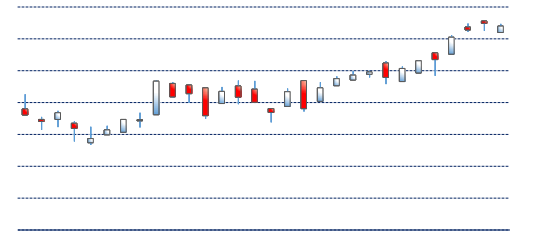
| Category | Series 0 | Series 1 | Series 2 | Series 3 |
|---|---|---|---|---|
| 2016-06-09 | 57.2 | 57.47 | 57.2 | 57.4 |
| 2016-06-08 | 57.56 | 57.56 | 57.25 | 57.49 |
| 2016-06-07 | 57.37 | 57.48 | 57.22 | 57.28 |
| 2016-06-06 | 56.52 | 57.12 | 56.52 | 57.05 |
| 2016-06-03 | 56.56 | 56.56 | 55.84 | 56.35 |
| 2016-06-02 | 55.93 | 56.33 | 55.93 | 56.31 |
| 2016-06-01 | 55.66 | 56.13 | 55.66 | 56.07 |
| 2016-05-31 | 56.24 | 56.3 | 55.58 | 55.79 |
| 2016-05-27 | 55.89 | 56 | 55.79 | 55.96 |
| 2016-05-26 | 55.71 | 55.99 | 55.71 | 55.86 |
| 2016-05-25 | 55.53 | 55.82 | 55.53 | 55.75 |
| 2016-05-24 | 55.04 | 55.64 | 55.04 | 55.46 |
| 2016-05-23 | 55.69 | 55.69 | 54.72 | 54.81 |
| 2016-05-20 | 54.88 | 55.44 | 54.88 | 55.34 |
| 2016-05-19 | 54.81 | 54.81 | 54.38 | 54.69 |
| 2016-05-18 | 55.42 | 55.68 | 55.01 | 55.01 |
| 2016-05-17 | 55.52 | 55.69 | 54.95 | 55.17 |
| 2016-05-16 | 54.97 | 55.49 | 54.97 | 55.35 |
| 2016-05-13 | 55.46 | 55.46 | 54.49 | 54.59 |
| 2016-05-12 | 55.55 | 55.55 | 54.99 | 55.28 |
| 2016-05-11 | 55.6 | 55.64 | 55.15 | 55.18 |
| 2016-05-10 | 54.62 | 55.69 | 54.62 | 55.67 |
| 2016-05-09 | 54.46 | 54.68 | 54.22 | 54.46 |
| 2016-05-06 | 54.07 | 54.47 | 54.07 | 54.47 |
| 2016-05-05 | 53.99 | 54.27 | 53.99 | 54.14 |
| 2016-05-04 | 53.74 | 54.24 | 53.67 | 53.87 |
| 2016-05-03 | 54.35 | 54.41 | 53.78 | 54.19 |
| 2016-05-02 | 54.47 | 54.74 | 54.23 | 54.68 |
| 2016-04-29 | 54.47 | 54.55 | 54.14 | 54.41 |
| 2016-04-28 | 54.8 | 55.26 | 54.61 | 54.61 |